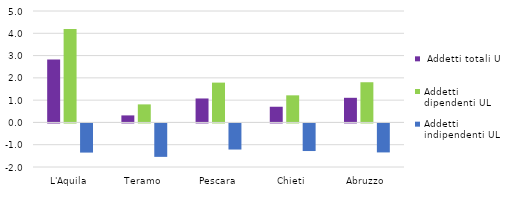
| Category |  Addetti totali UL | Addetti dipendenti UL | Addetti indipendenti UL |
|---|---|---|---|
| L'Aquila | 2.828 | 4.19 | -1.309 |
| Teramo | 0.315 | 0.81 | -1.5 |
| Pescara | 1.075 | 1.787 | -1.171 |
| Chieti | 0.704 | 1.216 | -1.239 |
| Abruzzo | 1.105 | 1.803 | -1.301 |